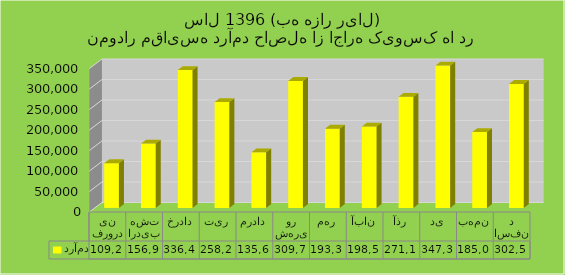
| Category | درآمد |
|---|---|
| فروردین | 109212 |
| اردیبهشت | 156946 |
| خرداد | 336408 |
| تیر | 258259 |
| مرداد | 135602 |
| شهریور | 309740 |
| مهر | 193354 |
| آبان | 198575 |
| آذر | 271198 |
| دی | 347332 |
| بهمن | 185032 |
| اسفند | 302540 |